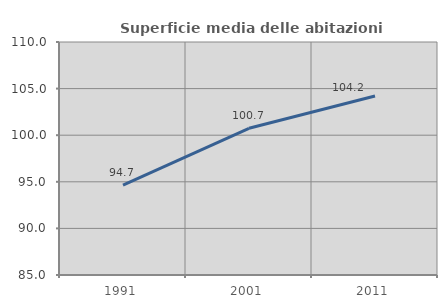
| Category | Superficie media delle abitazioni occupate |
|---|---|
| 1991.0 | 94.653 |
| 2001.0 | 100.738 |
| 2011.0 | 104.211 |